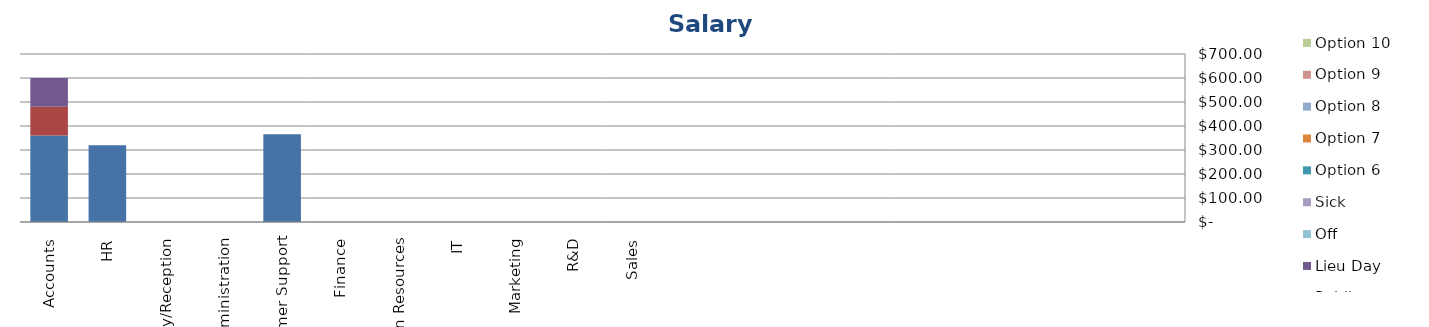
| Category | Regular Hours | Holidays | Public Holidays | Lieu Day | Off | Sick | Option 6 | Option 7 | Option 8 | Option 9 | Option 10 |
|---|---|---|---|---|---|---|---|---|---|---|---|
| Accounts | 360 | 120 | 0 | 120 | 0 | 0 | 0 | 0 | 0 | 0 | 0 |
| HR | 320 | 0 | 0 | 0 | 0 | 0 | 0 | 0 | 0 | 0 | 0 |
| Lobby/Reception | 0 | 0 | 0 | 0 | 0 | 0 | 0 | 0 | 0 | 0 | 0 |
| Administration | 0 | 0 | 0 | 0 | 0 | 0 | 0 | 0 | 0 | 0 | 0 |
| Customer Support | 366 | 0 | 0 | 0 | 0 | 0 | 0 | 0 | 0 | 0 | 0 |
| Finance | 0 | 0 | 0 | 0 | 0 | 0 | 0 | 0 | 0 | 0 | 0 |
| Human Resources | 0 | 0 | 0 | 0 | 0 | 0 | 0 | 0 | 0 | 0 | 0 |
| IT | 0 | 0 | 0 | 0 | 0 | 0 | 0 | 0 | 0 | 0 | 0 |
| Marketing | 0 | 0 | 0 | 0 | 0 | 0 | 0 | 0 | 0 | 0 | 0 |
| R&D | 0 | 0 | 0 | 0 | 0 | 0 | 0 | 0 | 0 | 0 | 0 |
| Sales | 0 | 0 | 0 | 0 | 0 | 0 | 0 | 0 | 0 | 0 | 0 |